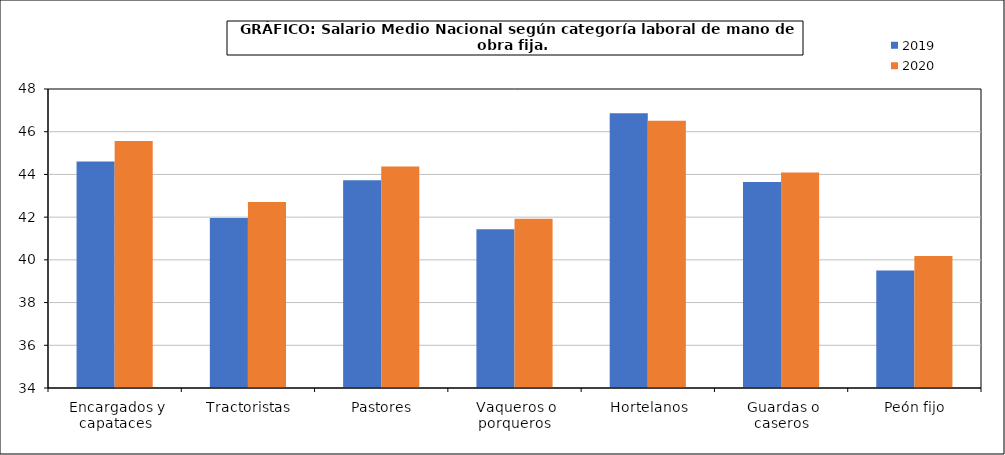
| Category | 2019 | 2020 |
|---|---|---|
|  Encargados y capataces | 44.6 | 45.56 |
|  Tractoristas | 41.96 | 42.71 |
|  Pastores | 43.73 | 44.37 |
|  Vaqueros o porqueros | 41.43 | 41.92 |
|  Hortelanos | 46.86 | 46.51 |
|  Guardas o caseros | 43.65 | 44.09 |
|  Peón fijo | 39.5 | 40.18 |